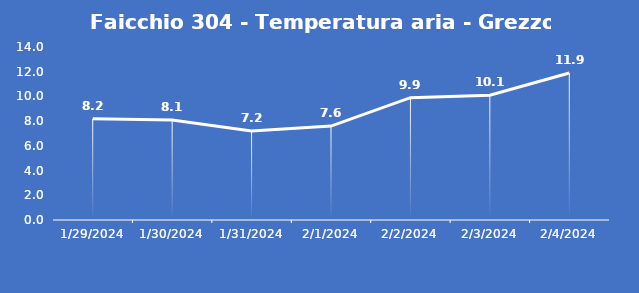
| Category | Faicchio 304 - Temperatura aria - Grezzo (°C) |
|---|---|
| 1/29/24 | 8.2 |
| 1/30/24 | 8.1 |
| 1/31/24 | 7.2 |
| 2/1/24 | 7.6 |
| 2/2/24 | 9.9 |
| 2/3/24 | 10.1 |
| 2/4/24 | 11.9 |